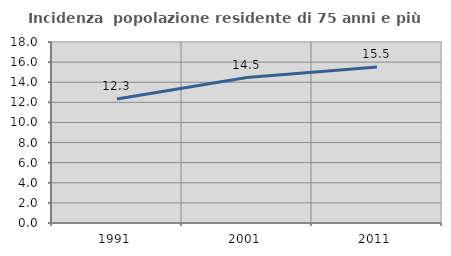
| Category | Incidenza  popolazione residente di 75 anni e più |
|---|---|
| 1991.0 | 12.33 |
| 2001.0 | 14.459 |
| 2011.0 | 15.511 |